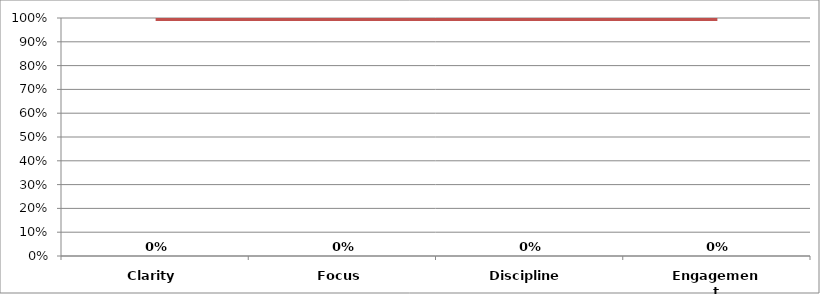
| Category | Series 0 |
|---|---|
| Clarity | 0 |
| Focus | 0 |
| Discipline | 0 |
| Engagement | 0 |